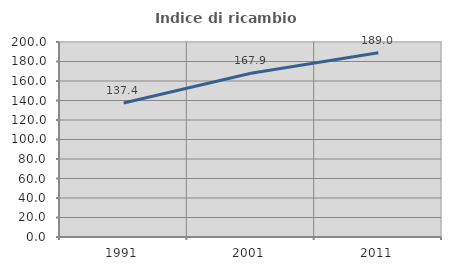
| Category | Indice di ricambio occupazionale  |
|---|---|
| 1991.0 | 137.394 |
| 2001.0 | 167.898 |
| 2011.0 | 188.993 |